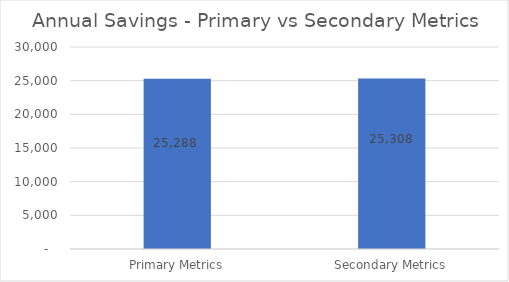
| Category | Series 0 |
|---|---|
|  Primary Metrics  | 25288 |
|  Secondary Metrics  | 25308 |